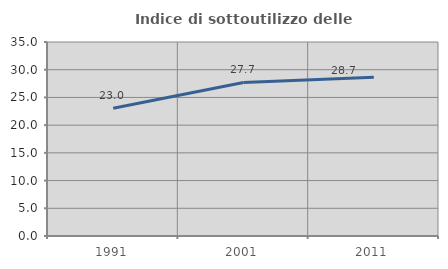
| Category | Indice di sottoutilizzo delle abitazioni  |
|---|---|
| 1991.0 | 23.046 |
| 2001.0 | 27.696 |
| 2011.0 | 28.652 |